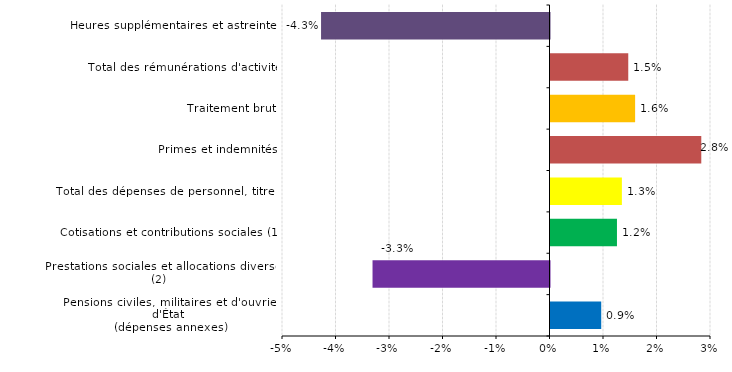
| Category | Évolution 2016/2015 |
|---|---|
| Pensions civiles, militaires et d'ouvriers d'État
(dépenses annexes) | 0.009 |
| Prestations sociales et allocations diverses (2) | -0.033 |
| Cotisations et contributions sociales (1) | 0.012 |
| Total des dépenses de personnel, titre 2 | 0.013 |
| Primes et indemnités | 0.028 |
| Traitement brut | 0.016 |
| Total des rémunérations d'activité | 0.015 |
| Heures supplémentaires et astreintes | -0.043 |